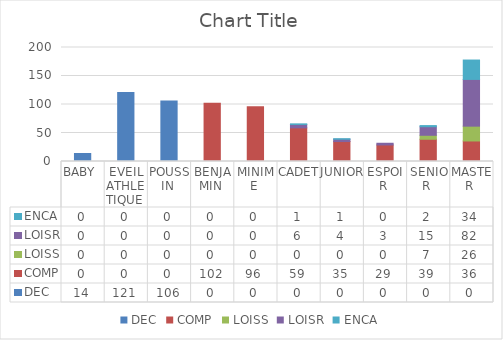
| Category | DEC | COMP | LOISS | LOISR | ENCA |
|---|---|---|---|---|---|
| BABY  | 14 | 0 | 0 | 0 | 0 |
| EVEIL ATHLETIQUE  | 121 | 0 | 0 | 0 | 0 |
| POUSSIN  | 106 | 0 | 0 | 0 | 0 |
| BENJAMIN  | 0 | 102 | 0 | 0 | 0 |
| MINIME  | 0 | 96 | 0 | 0 | 0 |
| CADET  | 0 | 59 | 0 | 6 | 1 |
| JUNIOR  | 0 | 35 | 0 | 4 | 1 |
| ESPOIR  | 0 | 29 | 0 | 3 | 0 |
| SENIOR  | 0 | 39 | 7 | 15 | 2 |
| MASTER  | 0 | 36 | 26 | 82 | 34 |